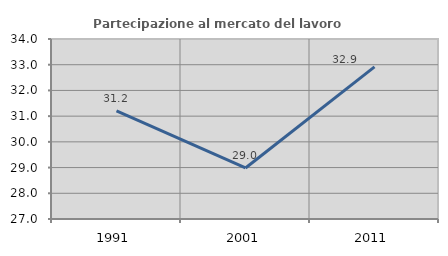
| Category | Partecipazione al mercato del lavoro  femminile |
|---|---|
| 1991.0 | 31.202 |
| 2001.0 | 28.986 |
| 2011.0 | 32.915 |